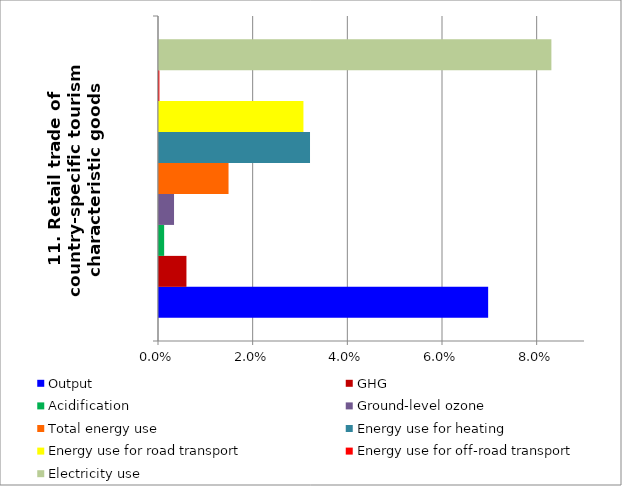
| Category | Output | GHG | Acidification | Ground-level ozone | Total energy use | Energy use for heating | Energy use for road transport | Energy use for off-road transport | Electricity use |
|---|---|---|---|---|---|---|---|---|---|
| 11. Retail trade of country-specific tourism characteristic goods | 0.07 | 0.006 | 0.001 | 0.003 | 0.015 | 0.032 | 0.031 | 0 | 0.083 |